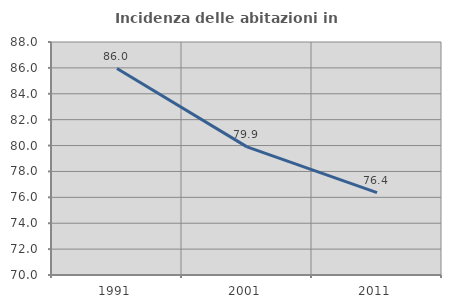
| Category | Incidenza delle abitazioni in proprietà  |
|---|---|
| 1991.0 | 85.953 |
| 2001.0 | 79.896 |
| 2011.0 | 76.362 |